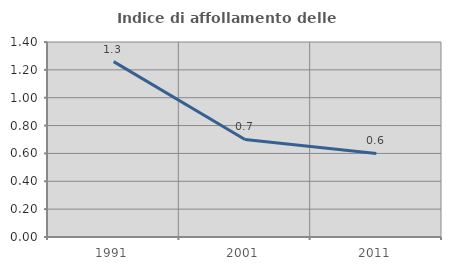
| Category | Indice di affollamento delle abitazioni  |
|---|---|
| 1991.0 | 1.259 |
| 2001.0 | 0.7 |
| 2011.0 | 0.6 |